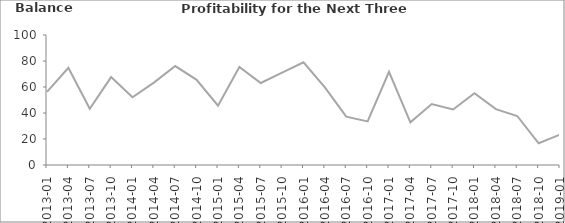
| Category | Balance |
|---|---|
| 2013-01 | 56.2 |
| 2013-04 | 74.8 |
| 2013-07 | 43.3 |
| 2013-10 | 67.6 |
| 2014-01 | 52.1 |
| 2014-04 | 63.4 |
| 2014-07 | 76.1 |
| 2014-10 | 65.5 |
| 2015-01 | 45.6 |
| 2015-04 | 75.4 |
| 2015-07 | 63.1 |
| 2015-10 | 71 |
| 2016-01 | 79 |
| 2016-04 | 59.7 |
| 2016-07 | 37.2 |
| 2016-10 | 33.5 |
| 2017-01 | 71.7 |
| 2017-04 | 32.8 |
| 2017-07 | 46.9 |
| 2017-10 | 42.7 |
| 2018-01 | 55.2 |
| 2018-04 | 43 |
| 2018-07 | 37.7 |
| 2018-10 | 16.7 |
| 2019-01 | 23.4 |